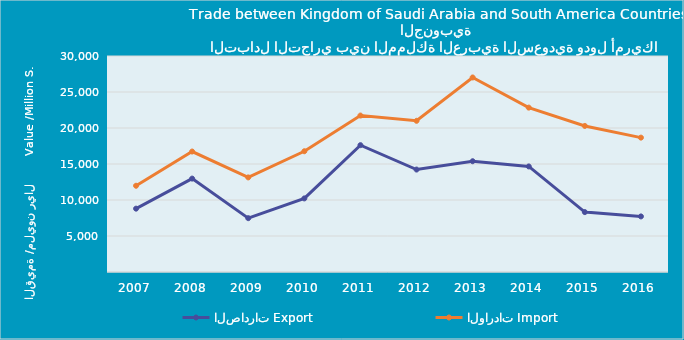
| Category | الصادرات | الواردات |
|---|---|---|
| 2007.0 | 8798414994 | 11978335945 |
| 2008.0 | 12972535158 | 16732280480 |
| 2009.0 | 7475730359 | 13137200907 |
| 2010.0 | 10221172538 | 16772396767 |
| 2011.0 | 17616286102 | 21729531433 |
| 2012.0 | 14228381136 | 20999857788 |
| 2013.0 | 15384831294 | 27018066833 |
| 2014.0 | 14661582763 | 22832014822 |
| 2015.0 | 8318863702 | 20285686225 |
| 2016.0 | 7719081816 | 18662037443 |